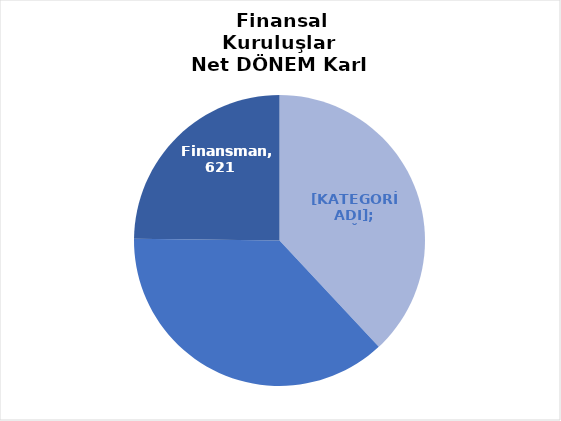
| Category | Series 0 |
|---|---|
| Finansal Kiralama  | 952 |
| Faktoring  | 929 |
| Finansman | 621 |